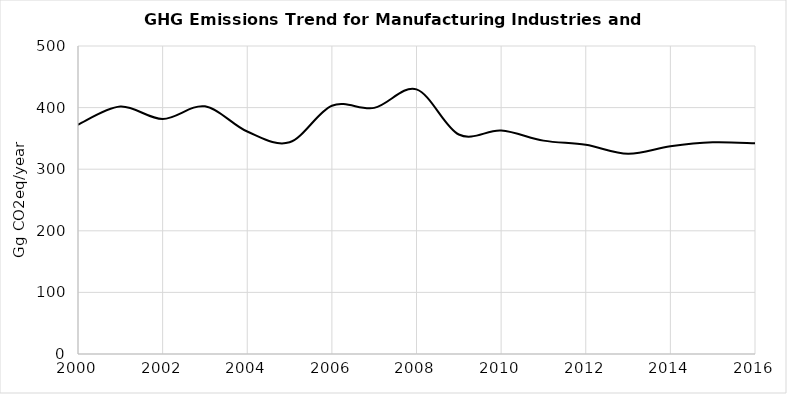
| Category | Series 0 |
|---|---|
| 2000.0 | 372.219 |
| 2001.0 | 401.619 |
| 2002.0 | 381.527 |
| 2003.0 | 402.04 |
| 2004.0 | 361.161 |
| 2005.0 | 343.711 |
| 2006.0 | 403.079 |
| 2007.0 | 399.528 |
| 2008.0 | 429.554 |
| 2009.0 | 356.325 |
| 2010.0 | 362.682 |
| 2011.0 | 346.396 |
| 2012.0 | 339.591 |
| 2013.0 | 325.044 |
| 2014.0 | 337.37 |
| 2015.0 | 343.789 |
| 2016.0 | 342.184 |